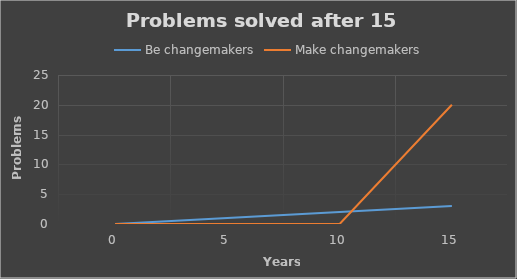
| Category | Be changemakers | Make changemakers |
|---|---|---|
| 0.0 | 0 | 0 |
| 5.0 | 1 | 0 |
| 10.0 | 2 | 0 |
| 15.0 | 3 | 20 |